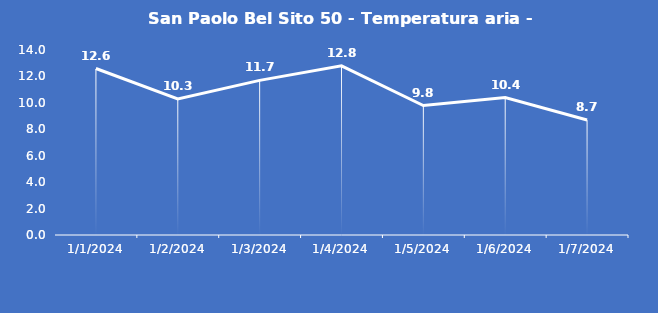
| Category | San Paolo Bel Sito 50 - Temperatura aria - Grezzo (°C) |
|---|---|
| 1/1/24 | 12.6 |
| 1/2/24 | 10.3 |
| 1/3/24 | 11.7 |
| 1/4/24 | 12.8 |
| 1/5/24 | 9.8 |
| 1/6/24 | 10.4 |
| 1/7/24 | 8.7 |